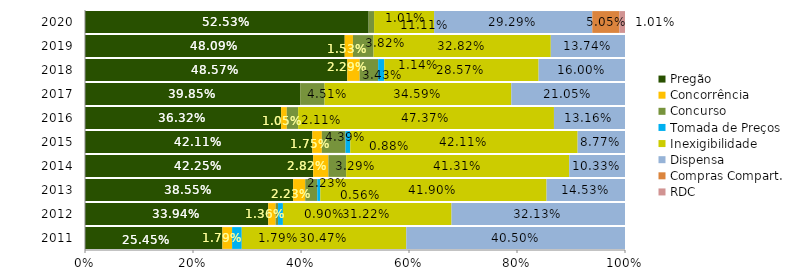
| Category | Pregão | Concorrência | Concurso | Tomada de Preços | Inexigibilidade | Dispensa | Compras Compart. | RDC |
|---|---|---|---|---|---|---|---|---|
| 2011.0 | 0.254 | 0.018 | 0 | 0.018 | 0.305 | 0.405 | 0 | 0 |
| 2012.0 | 0.339 | 0.014 | 0.005 | 0.009 | 0.312 | 0.321 | 0 | 0 |
| 2013.0 | 0.385 | 0.022 | 0.022 | 0.006 | 0.419 | 0.145 | 0 | 0 |
| 2014.0 | 0.423 | 0.028 | 0.033 | 0 | 0.413 | 0.103 | 0 | 0 |
| 2015.0 | 0.421 | 0.018 | 0.044 | 0.009 | 0.421 | 0.088 | 0 | 0 |
| 2016.0 | 0.363 | 0.011 | 0.021 | 0 | 0.474 | 0.132 | 0 | 0 |
| 2017.0 | 0.398 | 0 | 0.045 | 0 | 0.346 | 0.211 | 0 | 0 |
| 2018.0 | 0.486 | 0.023 | 0.034 | 0.011 | 0.286 | 0.16 | 0 | 0 |
| 2019.0 | 0.481 | 0.015 | 0.038 | 0 | 0.328 | 0.137 | 0 | 0 |
| 2020.0 | 0.525 | 0 | 0.01 | 0 | 0.111 | 0.293 | 0.051 | 0.01 |